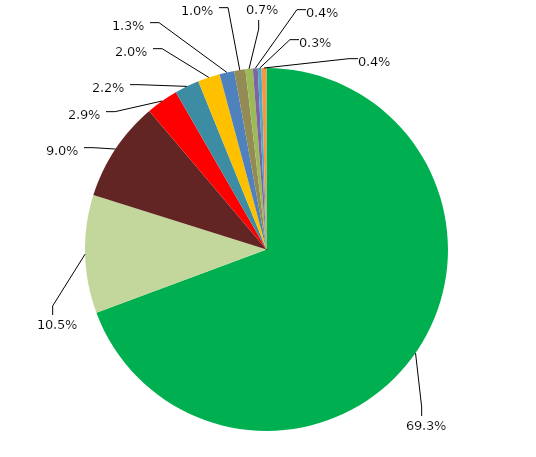
| Category | Series 0 |
|---|---|
| MS | 0.676 |
| SP | 0.103 |
| PR | 0.088 |
| RS | 0.028 |
| MG | 0.021 |
| MT | 0.019 |
| RO | 0.013 |
| RJ | 0.01 |
| SC | 0.006 |
| PA | 0.004 |
| PB | 0.003 |
| DF | 0.004 |